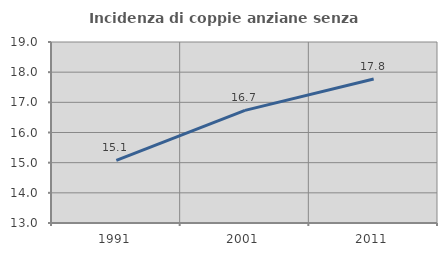
| Category | Incidenza di coppie anziane senza figli  |
|---|---|
| 1991.0 | 15.074 |
| 2001.0 | 16.734 |
| 2011.0 | 17.775 |